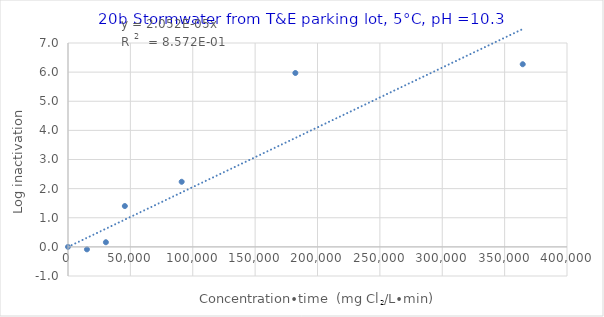
| Category | Series 0 |
|---|---|
| 0.0 | 0 |
| 15188.042430086787 | -0.084 |
| 30376.084860173574 | 0.159 |
| 45564.12729026036 | 1.402 |
| 91128.25458052072 | 2.235 |
| 182256.50916104144 | 5.97 |
| 364513.0183220829 | 6.271 |